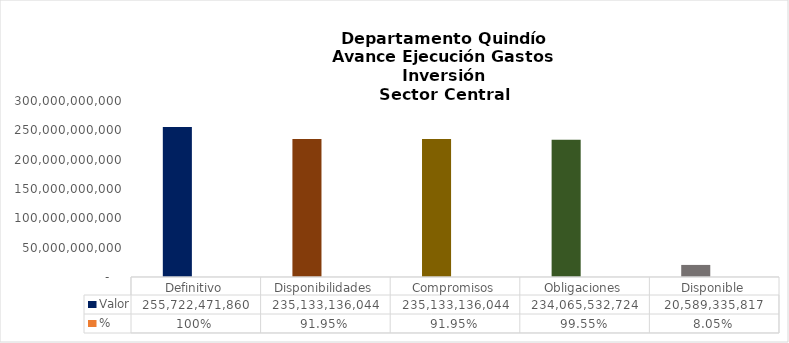
| Category | Valor | % |
|---|---|---|
| Definitivo | 255722471860.34 | 1 |
| Disponibilidades | 235133136043.8 | 0.919 |
| Compromisos | 235133136043.8 | 0.919 |
| Obligaciones | 234065532723.8 | 0.995 |
| Disponible | 20589335816.54 | 0.081 |